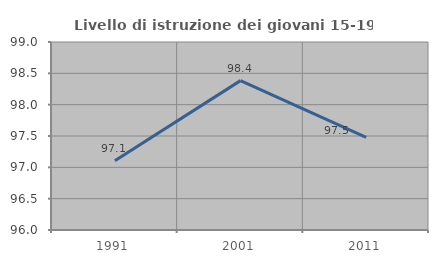
| Category | Livello di istruzione dei giovani 15-19 anni |
|---|---|
| 1991.0 | 97.106 |
| 2001.0 | 98.384 |
| 2011.0 | 97.476 |